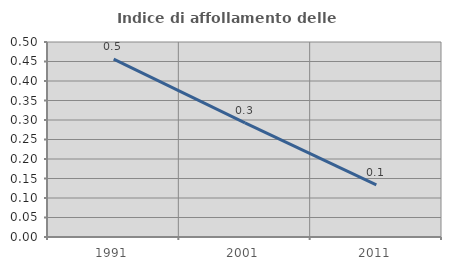
| Category | Indice di affollamento delle abitazioni  |
|---|---|
| 1991.0 | 0.456 |
| 2001.0 | 0.293 |
| 2011.0 | 0.134 |